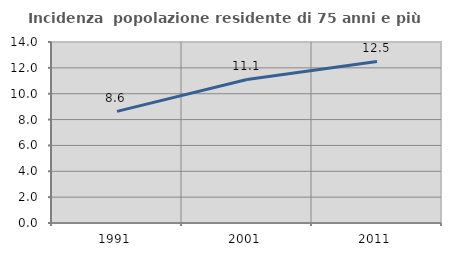
| Category | Incidenza  popolazione residente di 75 anni e più |
|---|---|
| 1991.0 | 8.635 |
| 2001.0 | 11.101 |
| 2011.0 | 12.492 |